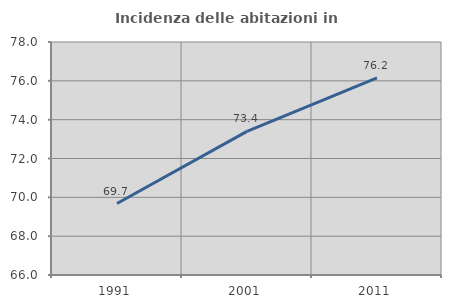
| Category | Incidenza delle abitazioni in proprietà  |
|---|---|
| 1991.0 | 69.68 |
| 2001.0 | 73.396 |
| 2011.0 | 76.158 |